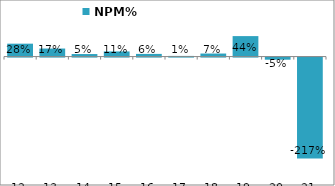
| Category | NPM% |
|---|---|
| 2012-03-31 | 0.277 |
| 2013-03-31 | 0.173 |
| 2014-03-31 | 0.054 |
| 2015-03-31 | 0.11 |
| 2016-03-31 | 0.057 |
| 2017-03-31 | 0.014 |
| 2018-03-31 | 0.065 |
| 2019-03-31 | 0.44 |
| 2020-03-31 | -0.046 |
| 2021-03-31 | -2.166 |